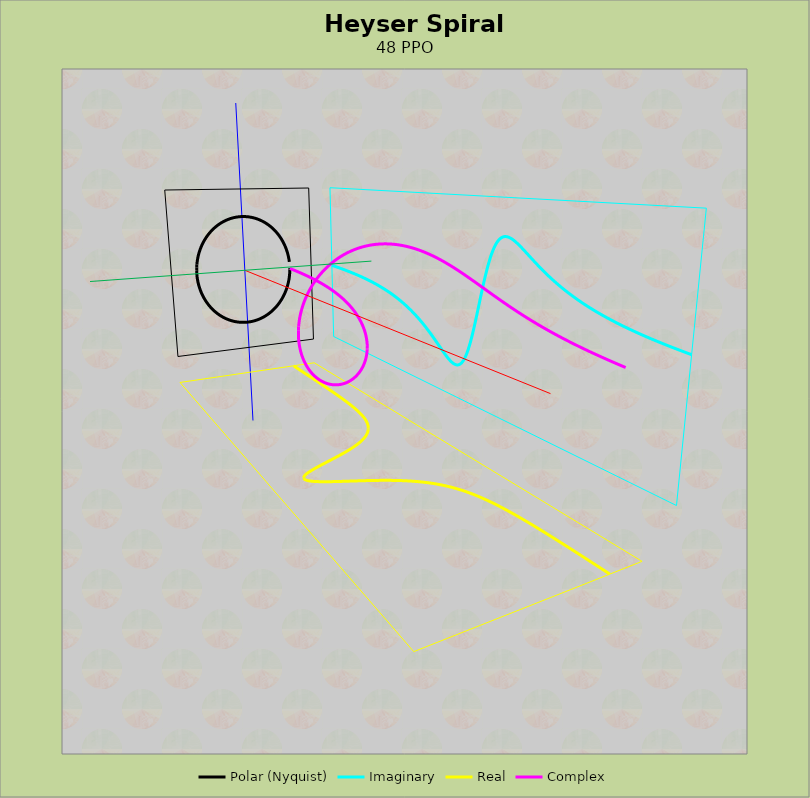
| Category |  Dummy Pie |
|---|---|
| 0 | 1 |